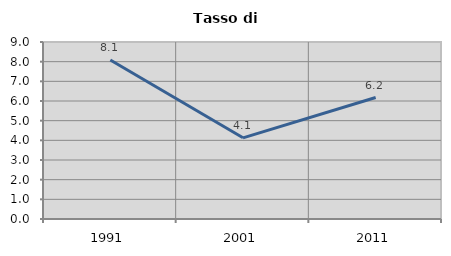
| Category | Tasso di disoccupazione   |
|---|---|
| 1991.0 | 8.084 |
| 2001.0 | 4.127 |
| 2011.0 | 6.176 |